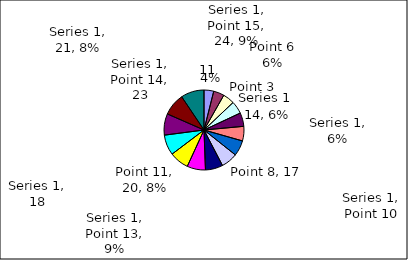
| Category | Series 1 |
|---|---|
| Point 1 | 10 |
| Point 2 | 11 |
| Point 3 | 12 |
| Point 4 | 13 |
| Point 5 | 14 |
| Point 6 | 15 |
| Point 7 | 16 |
| Point 8 | 17 |
| Point 9 | 18 |
| Point 10 | 19 |
| Point 11 | 20 |
| Point 12 | 21 |
| Point 13 | 22 |
| Point 14 | 23 |
| Point 15 | 24 |